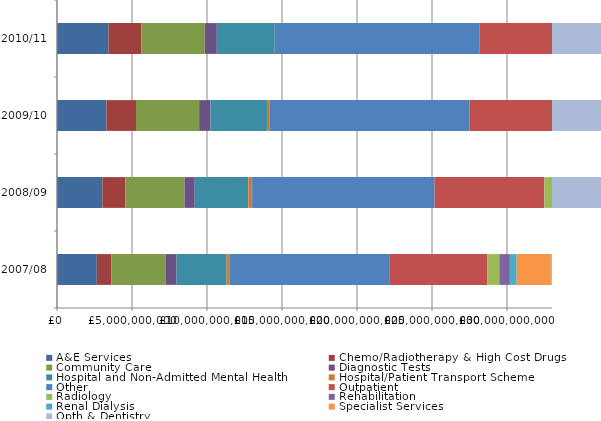
| Category | A&E Services | Chemo/Radiotherapy & High Cost Drugs | Community Care | Diagnostic Tests | Hospital and Non-Admitted Mental Health | Hospital/Patient Transport Scheme | Other | Outpatient | Radiology | Rehabilitation | Renal Dialysis | Specialist Services | Opth & Dentistry |
|---|---|---|---|---|---|---|---|---|---|---|---|---|---|
| 2007/08 | 2653789144 | 976800940 | 3630325787 | 714025656 | 3333571276 | 214203331 | 10623346440 | 6552679133 | 787120593 | 706962591 | 453477771 | 2281153728 | 1523208120 |
| 2008/09 | 3021863889 | 1530911288 | 3945710493 | 686042927 | 3570652030 | 254832199 | 12162031638.5 | 7317052852 | 800938521 | 868540789 | 489100439 | 2563576383 | 1599541161.5 |
| 2009/10 | 3296888378 | 1970519534 | 4208381075 | 758266445 | 3762869183 | 194852225 | 13307869308 | 7623618289 | 865482297 | 915858318 | 523116896 | 2758727668 | 1680648267 |
| 2010/11 | 3431897220 | 2183136937 | 4234047152 | 805583529 | 3863586450 | 5470622 | 13629397236.9 | 8516922013 | 821622082 | 945029495 | 528597833 | 2833537449 | 1716391363.9 |